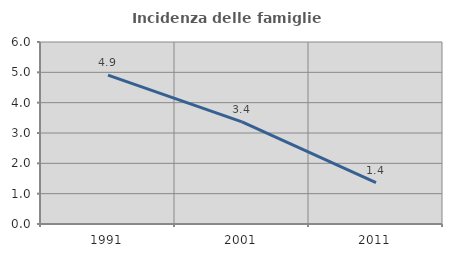
| Category | Incidenza delle famiglie numerose |
|---|---|
| 1991.0 | 4.907 |
| 2001.0 | 3.365 |
| 2011.0 | 1.365 |